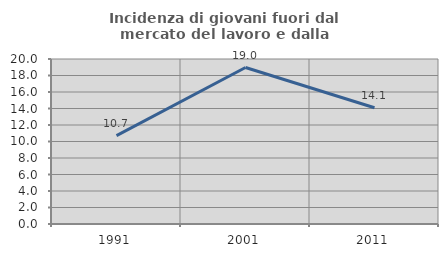
| Category | Incidenza di giovani fuori dal mercato del lavoro e dalla formazione  |
|---|---|
| 1991.0 | 10.719 |
| 2001.0 | 18.968 |
| 2011.0 | 14.097 |